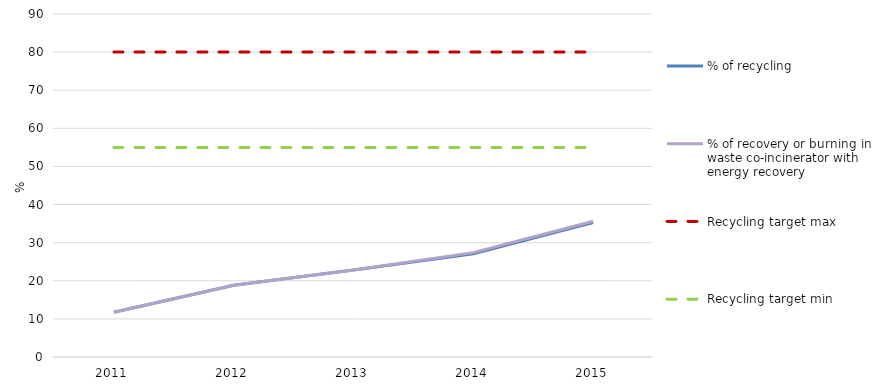
| Category | % of recycling  | % of recovery or burning in waste co-incinerator with energy recovery  | Recycling target max | Recycling target min |
|---|---|---|---|---|
| 2011.0 | 11.75 | 11.75 | 80 | 55 |
| 2012.0 | 18.82 | 18.82 | 80 | 55 |
| 2013.0 | 22.84 | 22.84 | 80 | 55 |
| 2014.0 | 27.08 | 27.38 | 80 | 55 |
| 2015.0 | 35.3 | 35.61 | 80 | 55 |